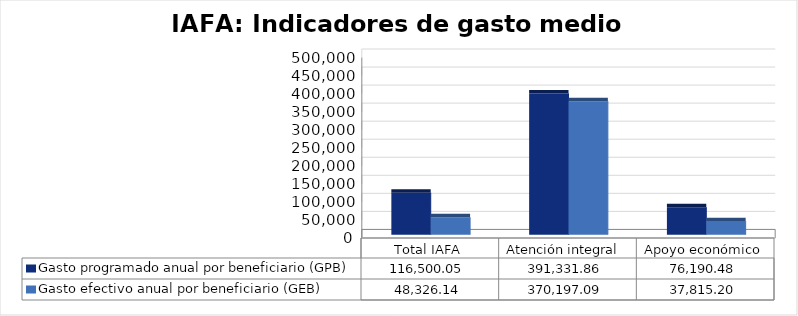
| Category | Gasto programado anual por beneficiario (GPB)  | Gasto efectivo anual por beneficiario (GEB)  |
|---|---|---|
| Total IAFA | 116500.052 | 48326.138 |
| Atención integral  | 391331.865 | 370197.092 |
| Apoyo económico | 76190.476 | 37815.205 |